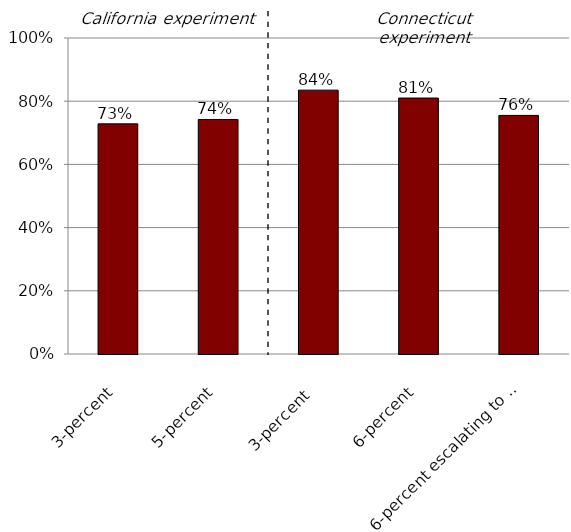
| Category | Participation |
|---|---|
| 3-percent | 0.728 |
| 5-percent | 0.742 |
| 3-percent  | 0.835 |
| 6-percent | 0.81 |
| 6-percent escalating to 10 percent | 0.755 |